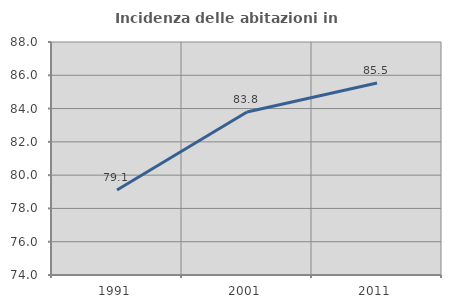
| Category | Incidenza delle abitazioni in proprietà  |
|---|---|
| 1991.0 | 79.107 |
| 2001.0 | 83.797 |
| 2011.0 | 85.532 |